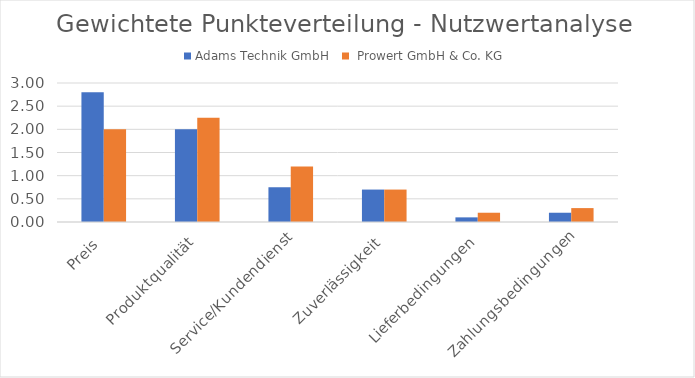
| Category | Adams Technik GmbH |  Prowert GmbH & Co. KG |
|---|---|---|
| Preis | 2.8 | 2 |
| Produktqualität | 2 | 2.25 |
| Service/Kundendienst | 0.75 | 1.2 |
| Zuverlässigkeit | 0.7 | 0.7 |
| Lieferbedingungen | 0.1 | 0.2 |
| Zahlungsbedingungen | 0.2 | 0.3 |